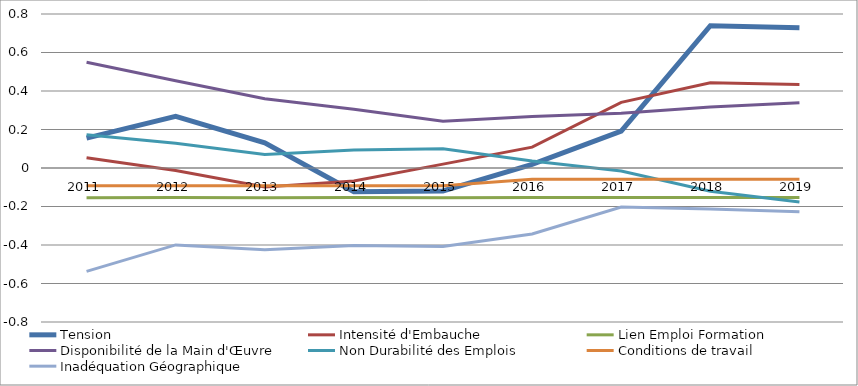
| Category | Tension | Intensité d'Embauche | Lien Emploi Formation | Disponibilité de la Main d'Œuvre | Non Durabilité des Emplois | Conditions de travail | Inadéquation Géographique |
|---|---|---|---|---|---|---|---|
| 2011 | 0.155 | 0.053 | -0.155 | 0.55 | 0.172 | -0.092 | -0.537 |
| 2012 | 0.268 | -0.013 | -0.153 | 0.453 | 0.128 | -0.092 | -0.399 |
| 2013 | 0.131 | -0.099 | -0.155 | 0.36 | 0.07 | -0.092 | -0.425 |
| 2014 | -0.123 | -0.067 | -0.153 | 0.306 | 0.094 | -0.092 | -0.403 |
| 2015 | -0.12 | 0.02 | -0.155 | 0.243 | 0.099 | -0.092 | -0.408 |
| 2016 | 0.019 | 0.108 | -0.153 | 0.268 | 0.036 | -0.059 | -0.343 |
| 2017 | 0.192 | 0.341 | -0.153 | 0.285 | -0.015 | -0.059 | -0.203 |
| 2018 | 0.739 | 0.443 | -0.153 | 0.316 | -0.121 | -0.059 | -0.213 |
| 2019 | 0.728 | 0.434 | -0.153 | 0.338 | -0.177 | -0.058 | -0.228 |